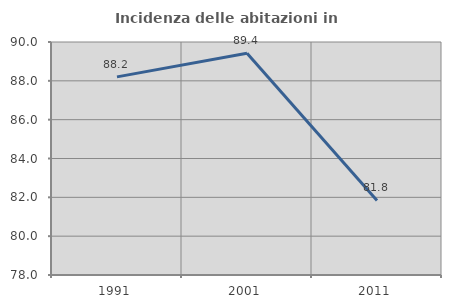
| Category | Incidenza delle abitazioni in proprietà  |
|---|---|
| 1991.0 | 88.204 |
| 2001.0 | 89.423 |
| 2011.0 | 81.837 |